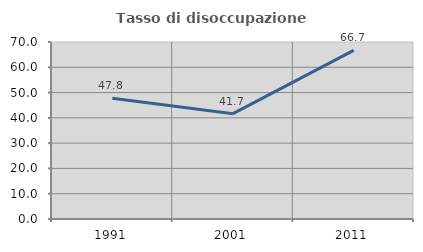
| Category | Tasso di disoccupazione giovanile  |
|---|---|
| 1991.0 | 47.761 |
| 2001.0 | 41.667 |
| 2011.0 | 66.667 |